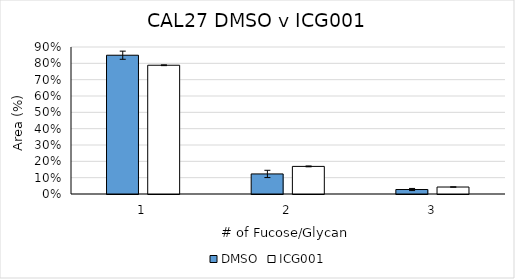
| Category | DMSO | ICG001 |
|---|---|---|
| 0 | 0.85 | 0.788 |
| 1 | 0.123 | 0.169 |
| 2 | 0.027 | 0.043 |